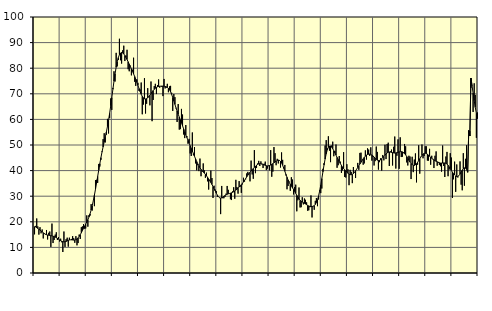
| Category | Piggar | Series 1 |
|---|---|---|
| nan | 15.1 | 18.08 |
| 87.0 | 18.4 | 17.99 |
| 87.0 | 21.3 | 17.7 |
| 87.0 | 18.2 | 17.41 |
| 87.0 | 15 | 17.1 |
| 87.0 | 17.9 | 16.77 |
| 87.0 | 15.5 | 16.39 |
| 87.0 | 17 | 16.03 |
| 87.0 | 13.5 | 15.71 |
| 87.0 | 15.6 | 15.41 |
| 87.0 | 15 | 15.16 |
| 87.0 | 16.8 | 14.97 |
| nan | 13.1 | 14.84 |
| 88.0 | 15.7 | 14.75 |
| 88.0 | 16.2 | 14.66 |
| 88.0 | 10.2 | 14.59 |
| 88.0 | 19.3 | 14.5 |
| 88.0 | 11.7 | 14.39 |
| 88.0 | 12.9 | 14.24 |
| 88.0 | 15 | 14.03 |
| 88.0 | 15.9 | 13.79 |
| 88.0 | 12.9 | 13.52 |
| 88.0 | 14 | 13.23 |
| 88.0 | 12.3 | 12.93 |
| nan | 13.4 | 12.64 |
| 89.0 | 12 | 12.4 |
| 89.0 | 8.2 | 12.24 |
| 89.0 | 16.2 | 12.17 |
| 89.0 | 10.2 | 12.21 |
| 89.0 | 13.2 | 12.33 |
| 89.0 | 13.8 | 12.53 |
| 89.0 | 10.3 | 12.74 |
| 89.0 | 13.8 | 12.89 |
| 89.0 | 13 | 12.96 |
| 89.0 | 13.3 | 12.95 |
| 89.0 | 14.4 | 12.9 |
| nan | 13.6 | 12.86 |
| 90.0 | 11.8 | 12.88 |
| 90.0 | 14.4 | 13.03 |
| 90.0 | 10.8 | 13.31 |
| 90.0 | 11.7 | 13.73 |
| 90.0 | 15 | 14.29 |
| 90.0 | 13.3 | 14.97 |
| 90.0 | 17.9 | 15.73 |
| 90.0 | 18.2 | 16.58 |
| 90.0 | 19.1 | 17.43 |
| 90.0 | 17.3 | 18.27 |
| 90.0 | 17.4 | 19.09 |
| nan | 22.5 | 19.92 |
| 91.0 | 18.1 | 20.82 |
| 91.0 | 22.6 | 21.86 |
| 91.0 | 22.4 | 23.11 |
| 91.0 | 26.9 | 24.58 |
| 91.0 | 24.4 | 26.29 |
| 91.0 | 28.3 | 28.23 |
| 91.0 | 26.1 | 30.4 |
| 91.0 | 36.3 | 32.72 |
| 91.0 | 36.4 | 35.17 |
| 91.0 | 35.2 | 37.71 |
| 91.0 | 42.6 | 40.24 |
| nan | 41.6 | 42.71 |
| 92.0 | 44.2 | 45.06 |
| 92.0 | 47.5 | 47.23 |
| 92.0 | 52.3 | 49.26 |
| 92.0 | 54.6 | 51.17 |
| 92.0 | 51 | 53.06 |
| 92.0 | 54 | 55.06 |
| 92.0 | 60.2 | 57.23 |
| 92.0 | 54.5 | 59.65 |
| 92.0 | 60.5 | 62.35 |
| 92.0 | 68.2 | 65.34 |
| 92.0 | 63.7 | 68.51 |
| nan | 72.3 | 71.75 |
| 93.0 | 78.8 | 74.93 |
| 93.0 | 74.8 | 77.85 |
| 93.0 | 86 | 80.41 |
| 93.0 | 80.7 | 82.51 |
| 93.0 | 83.2 | 84.14 |
| 93.0 | 91.5 | 85.28 |
| 93.0 | 83.1 | 85.94 |
| 93.0 | 81.8 | 86.14 |
| 93.0 | 87 | 85.99 |
| 93.0 | 88.8 | 85.57 |
| 93.0 | 82.8 | 84.95 |
| nan | 84.9 | 84.21 |
| 94.0 | 87.2 | 83.39 |
| 94.0 | 79.6 | 82.51 |
| 94.0 | 78.8 | 81.58 |
| 94.0 | 81 | 80.64 |
| 94.0 | 77.2 | 79.73 |
| 94.0 | 79.4 | 78.77 |
| 94.0 | 84.1 | 77.78 |
| 94.0 | 74.7 | 76.77 |
| 94.0 | 73.1 | 75.7 |
| 94.0 | 75.6 | 74.53 |
| 94.0 | 74.3 | 73.32 |
| nan | 71.1 | 72.09 |
| 95.0 | 71.7 | 70.88 |
| 95.0 | 74.4 | 69.82 |
| 95.0 | 62 | 68.98 |
| 95.0 | 65.8 | 68.39 |
| 95.0 | 76.1 | 68.06 |
| 95.0 | 62.3 | 67.99 |
| 95.0 | 66.1 | 68.11 |
| 95.0 | 72.2 | 68.41 |
| 95.0 | 69.1 | 68.88 |
| 95.0 | 65.5 | 69.45 |
| 95.0 | 74.8 | 70.08 |
| nan | 59.3 | 70.71 |
| 96.0 | 67.6 | 71.29 |
| 96.0 | 73 | 71.78 |
| 96.0 | 73.9 | 72.18 |
| 96.0 | 69.9 | 72.51 |
| 96.0 | 73.4 | 72.74 |
| 96.0 | 75.6 | 72.86 |
| 96.0 | 72.4 | 72.93 |
| 96.0 | 73 | 72.98 |
| 96.0 | 72.7 | 73 |
| 96.0 | 69.1 | 73 |
| 96.0 | 75.8 | 72.96 |
| nan | 72.1 | 72.88 |
| 97.0 | 72.4 | 72.73 |
| 97.0 | 73.9 | 72.49 |
| 97.0 | 70.6 | 72.14 |
| 97.0 | 72.9 | 71.58 |
| 97.0 | 73.1 | 70.79 |
| 97.0 | 70.4 | 69.75 |
| 97.0 | 63.3 | 68.54 |
| 97.0 | 69.9 | 67.22 |
| 97.0 | 68.7 | 65.86 |
| 97.0 | 64.3 | 64.54 |
| 97.0 | 59 | 63.26 |
| nan | 66 | 62.05 |
| 98.0 | 56 | 60.92 |
| 98.0 | 56.2 | 59.8 |
| 98.0 | 64.1 | 58.67 |
| 98.0 | 61.9 | 57.51 |
| 98.0 | 54.1 | 56.31 |
| 98.0 | 52.7 | 55.13 |
| 98.0 | 57.8 | 53.99 |
| 98.0 | 53.5 | 52.91 |
| 98.0 | 50.5 | 51.82 |
| 98.0 | 52.4 | 50.75 |
| 98.0 | 46.7 | 49.72 |
| nan | 45.7 | 48.69 |
| 99.0 | 54.9 | 47.66 |
| 99.0 | 46 | 46.63 |
| 99.0 | 49.2 | 45.59 |
| 99.0 | 42.8 | 44.53 |
| 99.0 | 40.1 | 43.54 |
| 99.0 | 42.1 | 42.66 |
| 99.0 | 39.8 | 41.86 |
| 99.0 | 44.7 | 41.12 |
| 99.0 | 37.8 | 40.49 |
| 99.0 | 39.7 | 39.95 |
| 99.0 | 42.8 | 39.47 |
| nan | 40.1 | 39.02 |
| 0.0 | 37.2 | 38.53 |
| 0.0 | 39.2 | 37.96 |
| 0.0 | 35.8 | 37.35 |
| 0.0 | 32.6 | 36.71 |
| 0.0 | 36.3 | 36.05 |
| 0.0 | 40 | 35.35 |
| 0.0 | 37.1 | 34.59 |
| 0.0 | 29.3 | 33.78 |
| 0.0 | 34.1 | 32.93 |
| 0.0 | 32.6 | 32.06 |
| 0.0 | 32 | 31.19 |
| nan | 29.7 | 30.4 |
| 1.0 | 29.8 | 29.78 |
| 1.0 | 29.5 | 29.4 |
| 1.0 | 23 | 29.28 |
| 1.0 | 34 | 29.38 |
| 1.0 | 29.2 | 29.64 |
| 1.0 | 29.2 | 29.96 |
| 1.0 | 29.7 | 30.25 |
| 1.0 | 31 | 30.52 |
| 1.0 | 34 | 30.76 |
| 1.0 | 32.5 | 30.92 |
| 1.0 | 31 | 31.05 |
| nan | 28.8 | 31.17 |
| 2.0 | 28.5 | 31.32 |
| 2.0 | 31.9 | 31.51 |
| 2.0 | 33.5 | 31.76 |
| 2.0 | 29 | 32.06 |
| 2.0 | 36.4 | 32.38 |
| 2.0 | 33.6 | 32.74 |
| 2.0 | 31 | 33.15 |
| 2.0 | 35.9 | 33.58 |
| 2.0 | 33.7 | 34.03 |
| 2.0 | 31.3 | 34.51 |
| 2.0 | 34.6 | 35.02 |
| nan | 37.2 | 35.59 |
| 3.0 | 35.7 | 36.22 |
| 3.0 | 36.6 | 36.89 |
| 3.0 | 38.9 | 37.56 |
| 3.0 | 39.5 | 38.21 |
| 3.0 | 38.6 | 38.82 |
| 3.0 | 35.8 | 39.36 |
| 3.0 | 43.9 | 39.87 |
| 3.0 | 38.5 | 40.35 |
| 3.0 | 36.8 | 40.81 |
| 3.0 | 48 | 41.26 |
| 3.0 | 39 | 41.7 |
| nan | 41 | 42.09 |
| 4.0 | 42.8 | 42.42 |
| 4.0 | 43.8 | 42.62 |
| 4.0 | 41.8 | 42.71 |
| 4.0 | 43.6 | 42.71 |
| 4.0 | 42.4 | 42.61 |
| 4.0 | 41 | 42.44 |
| 4.0 | 42.7 | 42.24 |
| 4.0 | 43.5 | 42.04 |
| 4.0 | 40.2 | 41.9 |
| 4.0 | 40.8 | 41.83 |
| 4.0 | 42 | 41.85 |
| nan | 40.1 | 41.98 |
| 5.0 | 48 | 42.17 |
| 5.0 | 37.6 | 42.43 |
| 5.0 | 39.6 | 42.72 |
| 5.0 | 49.2 | 43.04 |
| 5.0 | 46.8 | 43.38 |
| 5.0 | 42.1 | 43.71 |
| 5.0 | 44.6 | 43.98 |
| 5.0 | 42.8 | 44.1 |
| 5.0 | 44.1 | 44 |
| 5.0 | 41.2 | 43.62 |
| 5.0 | 47.1 | 42.97 |
| nan | 44.2 | 42.06 |
| 6.0 | 40.8 | 40.95 |
| 6.0 | 42.2 | 39.74 |
| 6.0 | 38.1 | 38.56 |
| 6.0 | 32.7 | 37.41 |
| 6.0 | 34 | 36.35 |
| 6.0 | 35.7 | 35.42 |
| 6.0 | 32.1 | 34.63 |
| 6.0 | 37.4 | 33.93 |
| 6.0 | 36.5 | 33.28 |
| 6.0 | 30.7 | 32.62 |
| 6.0 | 33.6 | 31.9 |
| nan | 34.5 | 31.12 |
| 7.0 | 24.1 | 30.34 |
| 7.0 | 28.4 | 29.6 |
| 7.0 | 33.4 | 28.93 |
| 7.0 | 25.6 | 28.38 |
| 7.0 | 25.7 | 27.99 |
| 7.0 | 29.6 | 27.7 |
| 7.0 | 26.8 | 27.46 |
| 7.0 | 29.1 | 27.21 |
| 7.0 | 28.6 | 26.95 |
| 7.0 | 27.6 | 26.68 |
| 7.0 | 24.3 | 26.42 |
| nan | 24.5 | 26.18 |
| 8.0 | 25.7 | 26.02 |
| 8.0 | 30.3 | 25.96 |
| 8.0 | 21.7 | 25.97 |
| 8.0 | 26.1 | 26.07 |
| 8.0 | 24.7 | 26.32 |
| 8.0 | 28.2 | 26.79 |
| 8.0 | 29.3 | 27.53 |
| 8.0 | 26.1 | 28.62 |
| 8.0 | 28.7 | 30.11 |
| 8.0 | 32.3 | 32.03 |
| 8.0 | 31.2 | 34.32 |
| nan | 33 | 36.87 |
| 9.0 | 40.7 | 39.55 |
| 9.0 | 42.9 | 42.14 |
| 9.0 | 49.8 | 44.5 |
| 9.0 | 51.9 | 46.53 |
| 9.0 | 48.7 | 48.09 |
| 9.0 | 53.4 | 49.09 |
| 9.0 | 47.8 | 49.57 |
| 9.0 | 43.3 | 49.58 |
| 9.0 | 49.8 | 49.21 |
| 9.0 | 51.3 | 48.56 |
| 9.0 | 45.6 | 47.77 |
| nan | 47.6 | 46.92 |
| 10.0 | 50.2 | 46.04 |
| 10.0 | 41.1 | 45.17 |
| 10.0 | 42.1 | 44.33 |
| 10.0 | 45.7 | 43.51 |
| 10.0 | 43.5 | 42.75 |
| 10.0 | 39.1 | 42.05 |
| 10.0 | 40.1 | 41.39 |
| 10.0 | 47.2 | 40.81 |
| 10.0 | 37.5 | 40.31 |
| 10.0 | 37.3 | 39.83 |
| 10.0 | 42.5 | 39.38 |
| nan | 40.5 | 38.97 |
| 11.0 | 34.3 | 38.63 |
| 11.0 | 40.3 | 38.41 |
| 11.0 | 39.5 | 38.37 |
| 11.0 | 35.1 | 38.52 |
| 11.0 | 41.4 | 38.85 |
| 11.0 | 39.2 | 39.33 |
| 11.0 | 37.1 | 39.93 |
| 11.0 | 40.6 | 40.57 |
| 11.0 | 43 | 41.22 |
| 11.0 | 40.3 | 41.9 |
| 11.0 | 46.9 | 42.58 |
| nan | 47 | 43.25 |
| 12.0 | 44 | 43.92 |
| 12.0 | 42.3 | 44.6 |
| 12.0 | 42.8 | 45.19 |
| 12.0 | 47.9 | 45.66 |
| 12.0 | 44.3 | 46.03 |
| 12.0 | 48.7 | 46.28 |
| 12.0 | 48.2 | 46.41 |
| 12.0 | 45.7 | 46.45 |
| 12.0 | 49.1 | 46.35 |
| 12.0 | 43.9 | 46.12 |
| 12.0 | 45.4 | 45.76 |
| nan | 42 | 45.3 |
| 13.0 | 43.7 | 44.82 |
| 13.0 | 49.4 | 44.38 |
| 13.0 | 47.3 | 44.08 |
| 13.0 | 40.4 | 43.95 |
| 13.0 | 43.3 | 43.99 |
| 13.0 | 44.8 | 44.23 |
| 13.0 | 40 | 44.61 |
| 13.0 | 46.1 | 45.05 |
| 13.0 | 44 | 45.53 |
| 13.0 | 50.1 | 46.04 |
| 13.0 | 44.5 | 46.5 |
| nan | 50.4 | 46.9 |
| 14.0 | 50.9 | 47.16 |
| 14.0 | 41.8 | 47.27 |
| 14.0 | 47.5 | 47.23 |
| 14.0 | 48.2 | 47.13 |
| 14.0 | 42 | 47.02 |
| 14.0 | 49.3 | 46.9 |
| 14.0 | 53.3 | 46.85 |
| 14.0 | 40.8 | 46.9 |
| 14.0 | 45.8 | 47.02 |
| 14.0 | 52.2 | 47.16 |
| 14.0 | 40.7 | 47.31 |
| nan | 53 | 47.41 |
| 15.0 | 45.3 | 47.42 |
| 15.0 | 45.4 | 47.31 |
| 15.0 | 46.8 | 47.06 |
| 15.0 | 50.4 | 46.66 |
| 15.0 | 49.5 | 46.15 |
| 15.0 | 43.2 | 45.5 |
| 15.0 | 42 | 44.77 |
| 15.0 | 45.8 | 44.02 |
| 15.0 | 45.5 | 43.33 |
| 15.0 | 36.7 | 42.74 |
| 15.0 | 45.4 | 42.3 |
| nan | 39.4 | 42.07 |
| 16.0 | 44.3 | 42.03 |
| 16.0 | 46.7 | 42.24 |
| 16.0 | 35.4 | 42.66 |
| 16.0 | 42.3 | 43.23 |
| 16.0 | 49.9 | 43.89 |
| 16.0 | 38.8 | 44.6 |
| 16.0 | 45.4 | 45.3 |
| 16.0 | 50.2 | 45.93 |
| 16.0 | 44.8 | 46.42 |
| 16.0 | 45.7 | 46.7 |
| 16.0 | 49.5 | 46.79 |
| nan | 49.5 | 46.67 |
| 17.0 | 43.9 | 46.4 |
| 17.0 | 43.9 | 46.03 |
| 17.0 | 48.5 | 45.62 |
| 17.0 | 42.3 | 45.22 |
| 17.0 | 45.8 | 44.82 |
| 17.0 | 44.6 | 44.46 |
| 17.0 | 41 | 44.17 |
| 17.0 | 45.8 | 43.89 |
| 17.0 | 47.5 | 43.65 |
| 17.0 | 41.9 | 43.45 |
| 17.0 | 43 | 43.27 |
| nan | 42.2 | 43.08 |
| 18.0 | 41.7 | 42.95 |
| 18.0 | 39.6 | 42.94 |
| 18.0 | 49.8 | 42.96 |
| 18.0 | 41.8 | 42.99 |
| 18.0 | 37.5 | 42.98 |
| 18.0 | 45.5 | 42.84 |
| 18.0 | 47.3 | 42.57 |
| 18.0 | 37.8 | 42.1 |
| 18.0 | 40.4 | 41.47 |
| 18.0 | 46.8 | 40.77 |
| 18.0 | 45.1 | 40.05 |
| nan | 29.3 | 39.38 |
| 19.0 | 36.6 | 38.79 |
| 19.0 | 43.5 | 38.28 |
| 19.0 | 31.7 | 37.88 |
| 19.0 | 42.4 | 37.67 |
| 19.0 | 37.3 | 37.72 |
| 19.0 | 38 | 38.07 |
| 19.0 | 43.6 | 38.64 |
| 19.0 | 34.5 | 39.39 |
| 19.0 | 32.3 | 40.17 |
| 19.0 | 46.8 | 40.76 |
| 19.0 | 34.1 | 41.06 |
| nan | 44.6 | 40.99 |
| 20.0 | 49.9 | 40.45 |
| 20.0 | 39.8 | 39.36 |
| 20.0 | 55.7 | 55.7 |
| 20.0 | 55.4 | 53.52 |
| 20.0 | 72.3 | 76.16 |
| 20.0 | 73 | 73.27 |
| 20.0 | 62.9 | 70.27 |
| 20.0 | 74.1 | 67.36 |
| 20.0 | 69.6 | 64.69 |
| 20.0 | 52.8 | 62.34 |
| 20.0 | 62.7 | 60.28 |